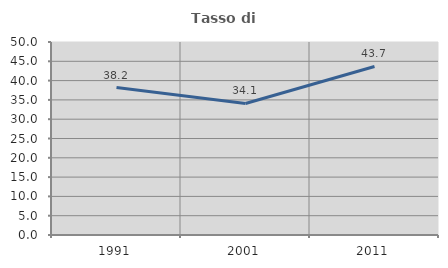
| Category | Tasso di occupazione   |
|---|---|
| 1991.0 | 38.189 |
| 2001.0 | 34.071 |
| 2011.0 | 43.655 |